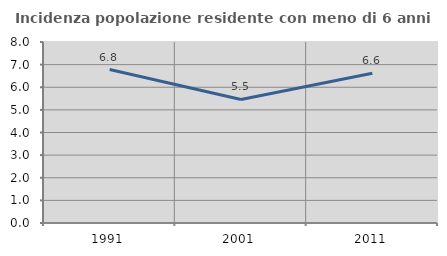
| Category | Incidenza popolazione residente con meno di 6 anni |
|---|---|
| 1991.0 | 6.781 |
| 2001.0 | 5.46 |
| 2011.0 | 6.621 |